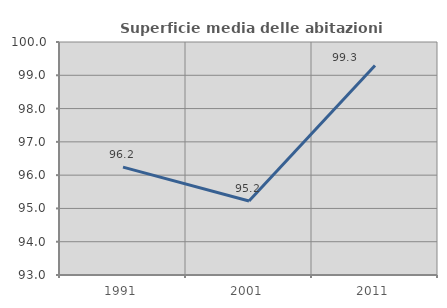
| Category | Superficie media delle abitazioni occupate |
|---|---|
| 1991.0 | 96.241 |
| 2001.0 | 95.222 |
| 2011.0 | 99.296 |